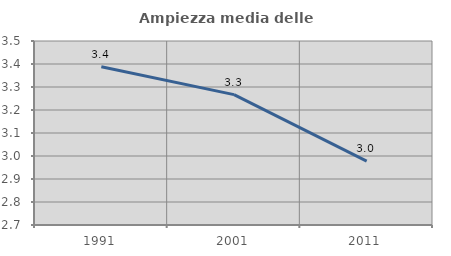
| Category | Ampiezza media delle famiglie |
|---|---|
| 1991.0 | 3.388 |
| 2001.0 | 3.267 |
| 2011.0 | 2.978 |